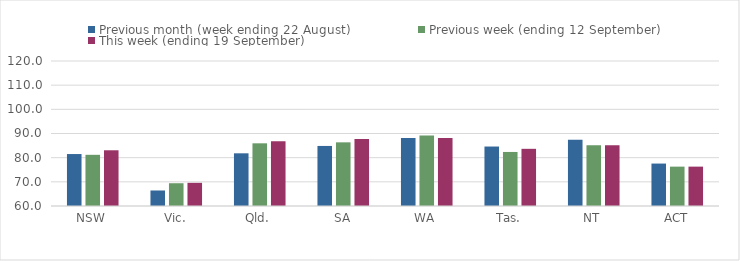
| Category | Previous month (week ending 22 August) | Previous week (ending 12 September) | This week (ending 19 September) |
|---|---|---|---|
| NSW | 81.5 | 81.18 | 83.06 |
| Vic. | 66.42 | 69.42 | 69.59 |
| Qld. | 81.8 | 85.94 | 86.79 |
| SA | 84.85 | 86.34 | 87.71 |
| WA | 88.18 | 89.19 | 88.17 |
| Tas. | 84.61 | 82.36 | 83.66 |
| NT | 87.41 | 85.14 | 85.14 |
| ACT | 77.56 | 76.29 | 76.29 |